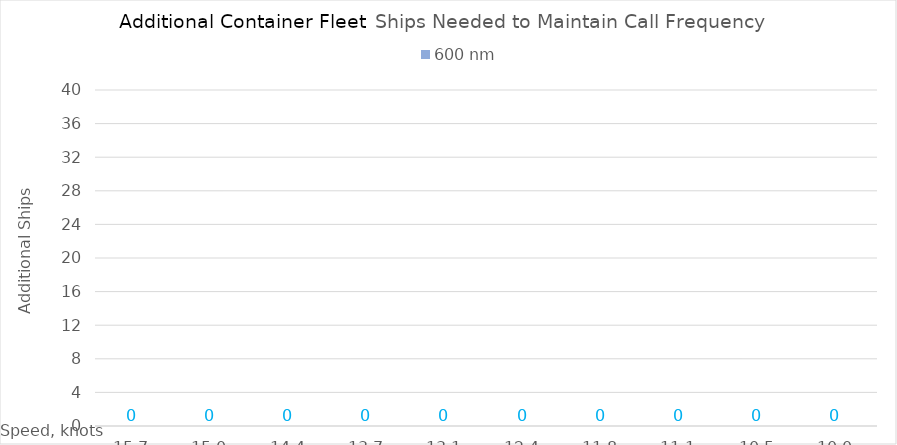
| Category | 600 |
|---|---|
| 15.65 | 0 |
| 15.0 | 0 |
| 14.35 | 0 |
| 13.7 | 0 |
| 13.049999999999999 | 0 |
| 12.399999999999999 | 0 |
| 11.749999999999998 | 0 |
| 11.099999999999998 | 0 |
| 10.449999999999998 | 0 |
| 10.0 | 0 |